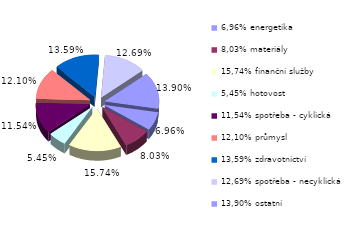
| Category | Series 0 |
|---|---|
| 6,96% energetika | 0.07 |
| 8,03% materiály | 0.08 |
| 15,74% finanční služby | 0.157 |
| 5,45% hotovost | 0.054 |
| 11,54% spotřeba - cyklická | 0.115 |
| 12,10% průmysl | 0.121 |
| 13,59% zdravotnictví | 0.136 |
| 12,69% spotřeba - necyklická | 0.127 |
| 13,90% ostatní | 0.139 |